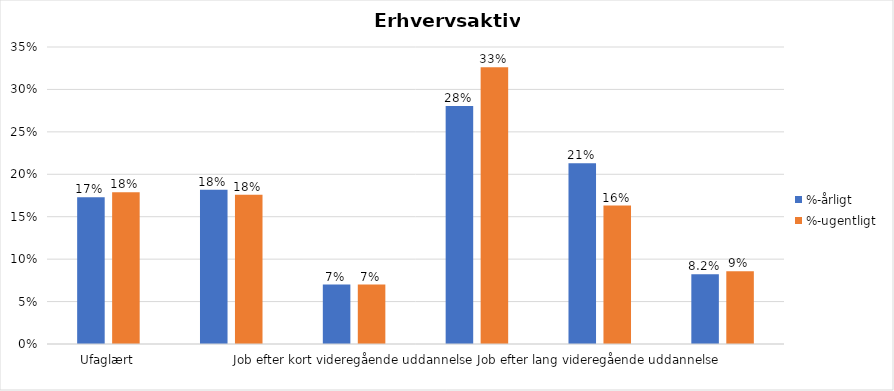
| Category | %-årligt | %-ugentligt |
|---|---|---|
| Ufaglært | 0.173 | 0.179 |
| Erhvervsfagligt job | 0.182 | 0.176 |
| Job efter kort videregående uddannelse | 0.07 | 0.07 |
| Job efter mellemlang videregående uddannelse | 0.28 | 0.326 |
| Job efter lang videregående uddannelse | 0.213 | 0.163 |
| Selvstændig | 0.082 | 0.086 |